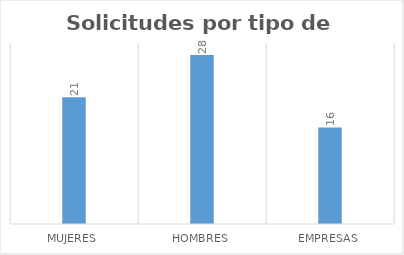
| Category | Series 0 |
|---|---|
| Mujeres  | 21 |
| Hombres  | 28 |
| Empresas  | 16 |